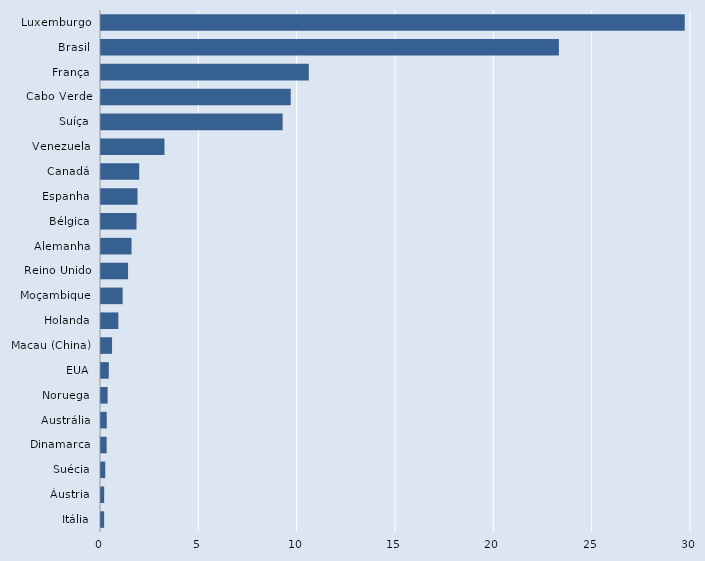
| Category | Series 0 |
|---|---|
| Itália | 0.16 |
| Áustria | 0.162 |
| Suécia | 0.216 |
| Dinamarca | 0.288 |
| Austrália | 0.292 |
| Noruega | 0.337 |
| EUA | 0.397 |
| Macau (China) | 0.562 |
| Holanda | 0.883 |
| Moçambique | 1.101 |
| Reino Unido | 1.375 |
| Alemanha | 1.553 |
| Bélgica | 1.806 |
| Espanha | 1.857 |
| Canadá | 1.944 |
| Venezuela | 3.227 |
| Suíça | 9.235 |
| Cabo Verde | 9.647 |
| França | 10.567 |
| Brasil | 23.284 |
| Luxemburgo | 29.682 |